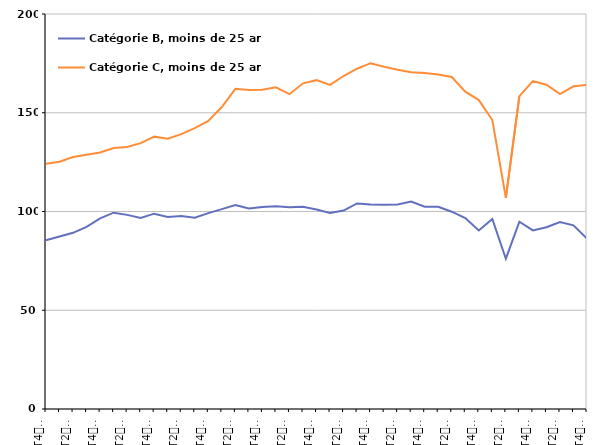
| Category | Catégorie B, moins de 25 ans | Catégorie C, moins de 25 ans |
|---|---|---|
| T4
2011 | 85.4 | 124.2 |
| T1
2012 | 87.3 | 125.2 |
| T2
2012 | 89.2 | 127.6 |
| T3
2012 | 92.2 | 128.7 |
| T4
2012 | 96.5 | 129.9 |
| T1
2013 | 99.4 | 132.1 |
| T2
2013 | 98.3 | 132.7 |
| T3
2013 | 96.7 | 134.6 |
| T4
2013 | 98.9 | 137.9 |
| T1
2014 | 97.2 | 136.9 |
| T2
2014 | 97.7 | 139.2 |
| T3
2014 | 96.9 | 142.2 |
| T4
2014 | 99.2 | 145.9 |
| T1
2015 | 101.2 | 152.9 |
| T2
2015 | 103.3 | 162.1 |
| T3
2015 | 101.5 | 161.5 |
| T4
2015 | 102.3 | 161.7 |
| T1
2016 | 102.7 | 162.9 |
| T2
2016 | 102.1 | 159.4 |
| T3
2016 | 102.4 | 164.9 |
| T4
2016 | 101 | 166.5 |
| T1
2017 | 99.2 | 164.1 |
| T2
2017 | 100.5 | 168.6 |
| T3
2017 | 104.1 | 172.3 |
| T4
2017 | 103.6 | 175.1 |
| T1
2018 | 103.4 | 173.3 |
| T2
2018 | 103.6 | 171.8 |
| T3
2018 | 105 | 170.5 |
| T4
2018 | 102.4 | 170.1 |
| T1
2019 | 102.4 | 169.4 |
| T2
2019 | 99.9 | 168.1 |
| T3
2019 | 96.7 | 160.7 |
| T4
2019 | 90.4 | 156.4 |
| T1
2020 | 96.2 | 146.3 |
| T2
2020 | 76.1 | 106.9 |
| T3
2020 | 94.8 | 158.4 |
| T4
2020 | 90.4 | 166 |
| T1
2021 | 92 | 164.2 |
| T2
2021 | 94.7 | 159.4 |
| T3
2021 | 93 | 163.4 |
| T4
2021 | 86.3 | 164.1 |